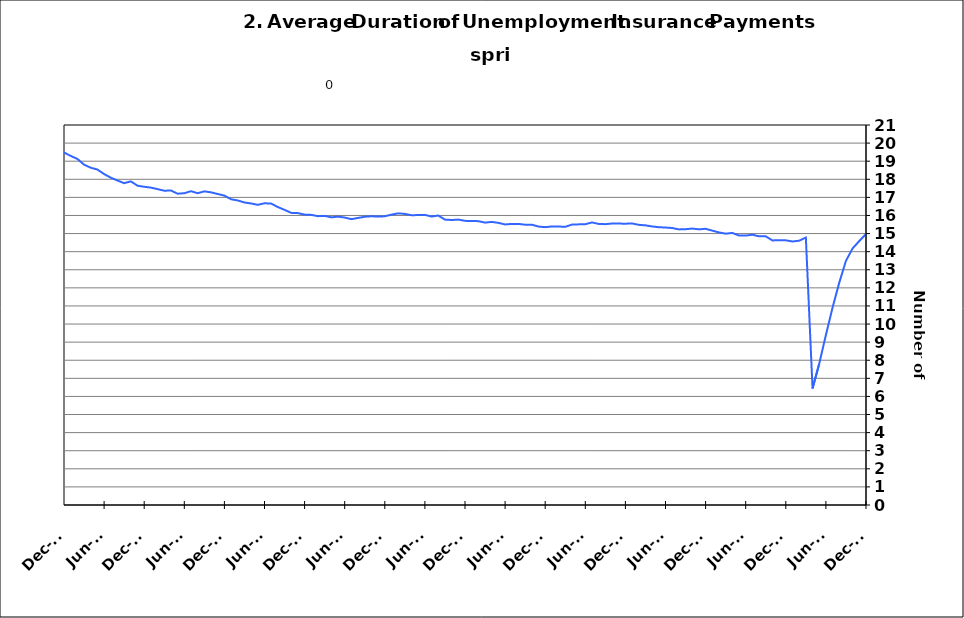
| Category | Average Duration |
|---|---|
| 1995-01-31 | 14.777 |
| 1995-02-28 | 14.761 |
| 1995-03-31 | 14.672 |
| 1995-04-30 | 14.601 |
| 1995-05-31 | 14.598 |
| 1995-06-30 | 14.51 |
| 1995-07-31 | 14.501 |
| 1995-08-31 | 14.41 |
| 1995-09-30 | 14.373 |
| 1995-10-31 | 14.393 |
| 1995-11-30 | 14.306 |
| 1995-12-31 | 14.23 |
| 1996-01-15 | 14.277 |
| 1996-02-15 | 14.204 |
| 1996-03-15 | 14.195 |
| 1996-04-15 | 14.116 |
| 1996-05-15 | 14.187 |
| 1996-06-15 | 14.214 |
| 1996-07-15 | 14.172 |
| 1996-08-15 | 14.174 |
| 1996-09-15 | 14.312 |
| 1996-10-15 | 14.308 |
| 1996-11-15 | 14.344 |
| 1996-12-15 | 14.461 |
| 1997-01-15 | 14.383 |
| 1997-02-15 | 14.413 |
| 1997-03-15 | 14.473 |
| 1997-04-15 | 14.518 |
| 1997-05-31 | 14.455 |
| 1997-06-30 | 14.38 |
| 1997-07-31 | 14.331 |
| 1997-08-31 | 14.279 |
| 1997-09-30 | 14.129 |
| 1997-10-31 | 14.07 |
| 1997-11-30 | 14.067 |
| 1997-12-31 | 13.993 |
| 1998-01-31 | 14.035 |
| 1998-02-28 | 14.047 |
| 1998-03-31 | 13.866 |
| 1998-04-30 | 13.764 |
| 1998-05-31 | 13.76 |
| 1998-06-30 | 13.675 |
| 1998-07-31 | 13.636 |
| 1998-08-31 | 13.558 |
| 1998-09-30 | 13.537 |
| 1998-10-31 | 13.462 |
| 1998-11-30 | 13.294 |
| 1998-12-31 | 13.16 |
| 1999-01-31 | 13.192 |
| 1999-02-28 | 13.297 |
| 1999-03-31 | 13.402 |
| 1999-04-30 | 13.443 |
| 1999-05-31 | 13.587 |
| 1999-06-30 | 13.74 |
| 1999-07-31 | 13.61 |
| 1999-08-31 | 13.717 |
| 1999-09-30 | 13.836 |
| 1999-10-31 | 14.032 |
| 1999-11-30 | 14.175 |
| 1999-12-31 | 14.303 |
| 2000-01-31 | 14.429 |
| 2000-02-29 | 14.376 |
| 2000-03-31 | 14.318 |
| 2000-04-30 | 14.352 |
| 2000-05-31 | 14.265 |
| 2000-06-30 | 14.174 |
| 2000-07-31 | 14.386 |
| 2000-08-31 | 14.362 |
| 2000-09-30 | 14.238 |
| 2000-10-31 | 14.236 |
| 2000-11-30 | 14.118 |
| 2000-12-31 | 14.004 |
| 2001-01-31 | 13.831 |
| 2001-02-28 | 13.708 |
| 2001-03-31 | 13.528 |
| 2001-04-30 | 13.376 |
| 2001-05-31 | 13.219 |
| 2001-06-30 | 13.171 |
| 2001-07-31 | 13.214 |
| 2001-08-31 | 13.157 |
| 2001-09-30 | 13.341 |
| 2001-10-31 | 13.178 |
| 2001-11-30 | 13.143 |
| 2001-12-31 | 13.4 |
| 2002-01-31 | 13.658 |
| 2002-02-28 | 13.952 |
| 2002-03-31 | 14.4 |
| 2002-04-30 | 14.946 |
| 2002-05-31 | 15.299 |
| 2002-06-30 | 15.677 |
| 2002-07-31 | 15.88 |
| 2002-08-31 | 16.087 |
| 2002-09-30 | 16.301 |
| 2002-10-31 | 16.624 |
| 2002-11-30 | 17.004 |
| 2002-12-31 | 17.229 |
| 2003-01-31 | 17.337 |
| 2003-02-28 | 17.359 |
| 2003-03-31 | 17.387 |
| 2003-04-30 | 17.118 |
| 2003-05-31 | 17.133 |
| 2003-06-30 | 17.187 |
| 2003-07-31 | 17.249 |
| 2003-08-31 | 17.486 |
| 2003-09-30 | 17.575 |
| 2003-10-31 | 17.651 |
| 2003-11-30 | 17.867 |
| 2003-12-31 | 17.897 |
| 2004-01-31 | 17.88 |
| 2004-02-29 | 17.995 |
| 2004-03-31 | 17.897 |
| 2004-04-30 | 17.828 |
| 2004-05-31 | 17.883 |
| 2004-06-30 | 17.577 |
| 2004-07-31 | 17.405 |
| 2004-08-31 | 17.207 |
| 2004-09-30 | 16.913 |
| 2004-10-31 | 16.869 |
| 2004-11-30 | 16.518 |
| 2004-12-31 | 16.342 |
| 2005-01-31 | 16.376 |
| 2005-02-28 | 16.223 |
| 2005-03-31 | 16.07 |
| 2005-04-30 | 15.951 |
| 2005-05-31 | 15.826 |
| 2005-06-30 | 15.815 |
| 2005-07-31 | 15.99 |
| 2005-08-31 | 15.796 |
| 2005-09-30 | 15.736 |
| 2005-10-31 | 15.703 |
| 2005-11-30 | 15.697 |
| 2005-12-31 | 15.583 |
| 2006-01-31 | 15.497 |
| 2006-02-28 | 15.415 |
| 2006-03-31 | 15.399 |
| 2006-04-30 | 15.663 |
| 2006-05-31 | 15.487 |
| 2006-06-30 | 15.333 |
| 2006-07-31 | 15.144 |
| 2006-08-31 | 14.91 |
| 2006-09-30 | 14.845 |
| 2006-10-31 | 14.766 |
| 2006-11-30 | 14.588 |
| 2006-12-31 | 14.585 |
| 2007-01-31 | 14.485 |
| 2007-02-28 | 14.412 |
| 2007-03-31 | 14.336 |
| 2007-04-30 | 14.26 |
| 2007-05-31 | 14.261 |
| 2007-06-30 | 14.479 |
| 2007-07-30 | 14.599 |
| 2007-08-31 | 14.843 |
| 2007-09-30 | 14.99 |
| 2007-10-31 | 15.008 |
| 2007-11-15 | 15.072 |
| 2007-12-15 09:36:00 | 15.095 |
| 2008-01-14 19:12:00 | 15.068 |
| 2008-02-14 04:48:00 | 15.026 |
| 2008-03-15 14:24:00 | 15.176 |
| 2008-04-15 | 15.005 |
| 2008-05-15 09:36:00 | 15.047 |
| 2008-06-14 19:12:00 | 15.073 |
| 2008-07-15 04:48:00 | 15.03 |
| 2008-08-14 14:24:00 | 15.17 |
| 2008-09-14 | 15.292 |
| 2008-10-14 09:36:00 | 15.161 |
| 2008-11-13 19:12:00 | 14.99 |
| 2008-12-14 04:48:00 | 14.905 |
| 2009-01-13 14:24:00 | 14.874 |
| 2009-02-13 | 14.935 |
| 2009-03-15 09:36:00 | 15.173 |
| 2009-04-14 19:12:00 | 15.519 |
| 2009-05-15 04:48:00 | 15.914 |
| 2009-06-14 14:24:00 | 16.348 |
| 2009-07-15 | 16.557 |
| 2009-08-14 09:36:00 | 16.984 |
| 2009-09-13 19:12:00 | 17.215 |
| 2009-10-14 04:48:00 | 17.535 |
| 2009-11-13 14:24:00 | 18.106 |
| 2009-12-14 | 18.54 |
| 2010-01-13 09:36:00 | 18.944 |
| 2010-02-12 19:12:00 | 19.336 |
| 2010-03-15 04:48:00 | 19.768 |
| 2010-04-14 14:24:00 | 19.926 |
| 2010-05-15 | 19.977 |
| 2010-06-14 09:36:00 | 19.94 |
| 2010-07-14 19:12:00 | 19.962 |
| 2010-08-14 04:48:00 | 19.819 |
| 2010-09-13 14:24:00 | 19.804 |
| 2010-10-14 | 19.667 |
| 2010-11-13 09:36:00 | 19.551 |
| 2010-12-13 19:12:00 | 19.477 |
| 2011-01-13 04:48:00 | 19.292 |
| 2011-02-12 14:24:00 | 19.125 |
| 2011-03-15 | 18.81 |
| 2011-04-14 09:36:00 | 18.639 |
| 2011-05-14 19:12:00 | 18.54 |
| 2011-06-14 04:48:00 | 18.288 |
| 2011-07-14 14:24:00 | 18.091 |
| 2011-08-14 | 17.932 |
| 2011-09-13 09:36:00 | 17.786 |
| 2011-10-13 19:12:00 | 17.884 |
| 2011-11-13 04:48:00 | 17.646 |
| 2011-12-13 14:24:00 | 17.586 |
| 2012-01-13 | 17.54 |
| 2012-02-12 09:36:00 | 17.456 |
| 2012-03-13 19:12:00 | 17.368 |
| 2012-04-13 04:48:00 | 17.381 |
| 2012-05-13 14:24:00 | 17.203 |
| 2012-06-13 | 17.23 |
| 2012-07-13 09:36:00 | 17.342 |
| 2012-08-12 19:12:00 | 17.231 |
| 2012-09-12 04:48:00 | 17.333 |
| 2012-10-12 14:24:00 | 17.279 |
| 2012-11-12 | 17.187 |
| 2012-12-12 09:36:00 | 17.098 |
| 2013-01-11 19:12:00 | 16.896 |
| 2013-02-11 04:48:00 | 16.83 |
| 2013-03-13 14:24:00 | 16.718 |
| 2013-04-13 | 16.663 |
| 2013-05-13 09:36:00 | 16.59 |
| 2013-06-12 19:12:00 | 16.673 |
| 2013-07-13 04:48:00 | 16.659 |
| 2013-08-12 14:24:00 | 16.466 |
| 2013-09-12 | 16.311 |
| 2013-10-12 09:36:00 | 16.144 |
| 2013-11-11 19:12:00 | 16.13 |
| 2013-12-12 04:48:00 | 16.048 |
| 2014-01-11 14:24:00 | 16.033 |
| 2014-02-11 | 15.962 |
| 2014-03-13 09:36:00 | 15.979 |
| 2014-04-12 19:12:00 | 15.897 |
| 2014-05-13 04:48:00 | 15.936 |
| 2014-06-12 14:24:00 | 15.888 |
| 2014-07-13 | 15.797 |
| 2014-08-12 09:36:00 | 15.865 |
| 2014-09-11 19:12:00 | 15.93 |
| 2014-10-12 04:48:00 | 15.956 |
| 2014-11-11 14:24:00 | 15.939 |
| 2014-12-12 | 15.955 |
| 2015-01-11 09:36:00 | 16.046 |
| 2015-02-10 19:12:00 | 16.117 |
| 2015-03-13 04:48:00 | 16.086 |
| 2015-04-12 14:24:00 | 16.014 |
| 2015-05-13 | 16.023 |
| 2015-06-12 09:36:00 | 16.033 |
| 2015-07-12 19:12:00 | 15.941 |
| 2015-08-12 04:48:00 | 15.997 |
| 2015-09-11 14:24:00 | 15.772 |
| 2015-10-12 | 15.749 |
| 2015-11-11 09:36:00 | 15.773 |
| 2015-12-11 19:12:00 | 15.704 |
| 2016-01-11 04:48:00 | 15.692 |
| 2016-02-10 14:24:00 | 15.687 |
| 2016-03-12 | 15.604 |
| 2016-04-11 09:36:00 | 15.646 |
| 2016-05-11 19:12:00 | 15.592 |
| 2016-06-11 04:48:00 | 15.504 |
| 2016-07-11 14:24:00 | 15.535 |
| 2016-08-11 | 15.535 |
| 2016-09-10 09:36:00 | 15.49 |
| 2016-10-10 19:12:00 | 15.491 |
| 2016-11-10 04:48:00 | 15.386 |
| 2016-12-10 14:24:00 | 15.355 |
| 2017-01-10 | 15.392 |
| 2017-02-09 09:36:00 | 15.391 |
| 2017-03-11 19:12:00 | 15.372 |
| 2017-04-11 04:48:00 | 15.495 |
| 2017-05-11 14:24:00 | 15.509 |
| 2017-06-11 | 15.518 |
| 2017-07-11 09:36:00 | 15.616 |
| 2017-08-10 19:12:00 | 15.534 |
| 2017-09-10 04:48:00 | 15.52 |
| 2017-10-10 14:24:00 | 15.554 |
| 2017-11-10 | 15.552 |
| 2017-12-10 09:36:00 | 15.547 |
| 2018-01-09 19:12:00 | 15.558 |
| 2018-02-09 04:48:00 | 15.483 |
| 2018-03-11 14:24:00 | 15.454 |
| 2018-04-11 | 15.393 |
| 2018-05-11 09:36:00 | 15.352 |
| 2018-06-10 19:12:00 | 15.333 |
| 2018-07-11 04:48:00 | 15.308 |
| 2018-08-10 14:24:00 | 15.231 |
| 2018-09-10 | 15.241 |
| 2018-10-10 09:36:00 | 15.277 |
| 2018-11-09 19:12:00 | 15.234 |
| 2018-12-10 04:48:00 | 15.264 |
| 2019-01-09 14:24:00 | 15.161 |
| 2019-02-09 | 15.064 |
| 2019-03-11 09:36:00 | 14.995 |
| 2019-04-10 19:12:00 | 15.036 |
| 2019-05-11 04:48:00 | 14.892 |
| 2019-06-10 14:24:00 | 14.889 |
| 2019-07-11 | 14.937 |
| 2019-08-10 09:36:00 | 14.848 |
| 2019-09-09 19:12:00 | 14.848 |
| 2019-10-10 04:48:00 | 14.621 |
| 2019-11-09 14:24:00 | 14.633 |
| 2019-12-10 | 14.625 |
| 2020-01-09 09:36:00 | 14.564 |
| 2020-02-08 19:12:00 | 14.605 |
| 2020-03-10 04:48:00 | 14.78 |
| 2020-04-09 14:24:00 | 6.442 |
| 2020-05-10 | 7.803 |
| 2020-06-09 09:36:00 | 9.393 |
| 2020-07-09 19:12:00 | 10.916 |
| 2020-08-09 04:48:00 | 12.288 |
| 2020-09-08 14:24:00 | 13.497 |
| 2020-10-09 | 14.182 |
| 2020-11-08 09:36:00 | 14.588 |
| 2020-12-08 19:12:00 | 14.975 |